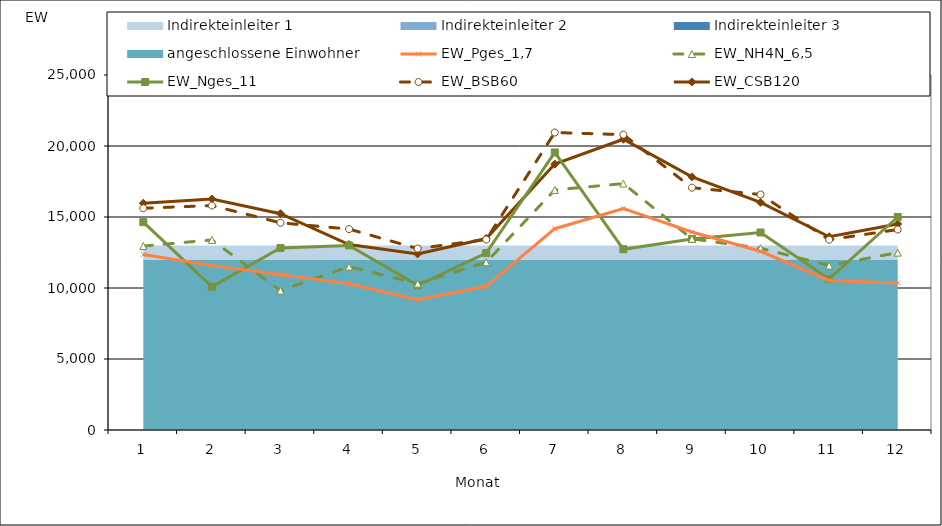
| Category | EW_CSB120 | EW_BSB60 | EW_Nges_11 | EW_NH4N_6,5 | EW_Pges_1,7 |
|---|---|---|---|---|---|
| 0 | 15966.667 | 15616.667 | 14636.364 | 12953.846 | 12352.941 |
| 1 | 16266.667 | 15808.333 | 10090.909 | 13384.615 | 11588.235 |
| 2 | 15233.333 | 14591.667 | 12818.182 | 9815.385 | 10941.176 |
| 3 | 13058.333 | 14150 | 13000 | 11507.692 | 10294.118 |
| 4 | 12400 | 12775 | 10181.818 | 10307.692 | 9176.471 |
| 5 | 13483.333 | 13413.333 | 12454.545 | 11815.385 | 10117.647 |
| 6 | 18725 | 20950 | 19545.455 | 16907.692 | 14176.471 |
| 7 | 20475 | 20800 | 12727.273 | 17353.846 | 15588.235 |
| 8 | 17825 | 17066.667 | 13454.545 | 13461.538 | 13941.176 |
| 9 | 16033.333 | 16583.333 | 13909.091 | 12800 | 12588.235 |
| 10 | 13608.333 | 13400 | 10636.364 | 11584.615 | 10529.412 |
| 11 | 14508.333 | 14116.667 | 15000 | 12492.308 | 10352.941 |